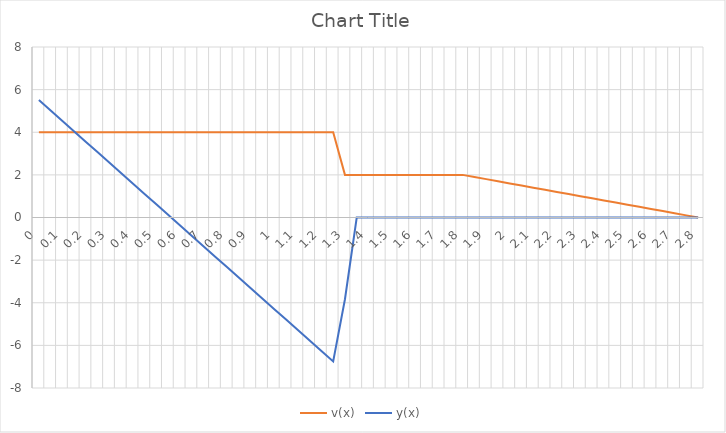
| Category | v(x) | y(x) |
|---|---|---|
| 0.0 | 4 | 5.51 |
| 0.05 | 4 | 5.019 |
| 0.1 | 4 | 4.528 |
| 0.15 | 4 | 4.038 |
| 0.2 | 4 | 3.548 |
| 0.25 | 4 | 3.057 |
| 0.3 | 4 | 2.566 |
| 0.35 | 4 | 2.076 |
| 0.4 | 4 | 1.586 |
| 0.45 | 4 | 1.095 |
| 0.5 | 4 | 0.605 |
| 0.55 | 4 | 0.114 |
| 0.6 | 4 | -0.377 |
| 0.65 | 4 | -0.867 |
| 0.7 | 4 | -1.357 |
| 0.75 | 4 | -1.848 |
| 0.8 | 4 | -2.338 |
| 0.85 | 4 | -2.829 |
| 0.9 | 4 | -3.319 |
| 0.95 | 4 | -3.81 |
| 1.0 | 4 | -4.301 |
| 1.05 | 4 | -4.791 |
| 1.1 | 4 | -5.281 |
| 1.15 | 4 | -5.772 |
| 1.2 | 4 | -6.263 |
| 1.25 | 4 | -6.753 |
| 1.3 | 2 | -3.835 |
| 1.35 | 2 | 0 |
| 1.4 | 2 | 0 |
| 1.45 | 2 | 0 |
| 1.5 | 2 | 0 |
| 1.55 | 2 | 0 |
| 1.6 | 2 | 0 |
| 1.65 | 2 | 0 |
| 1.7 | 2 | 0 |
| 1.75 | 2 | 0 |
| 1.8 | 2 | 0 |
| 1.85 | 1.9 | 0 |
| 1.9 | 1.8 | 0 |
| 1.95 | 1.7 | 0 |
| 2.0 | 1.6 | 0 |
| 2.05 | 1.5 | 0 |
| 2.1 | 1.4 | 0 |
| 2.15 | 1.3 | 0 |
| 2.2 | 1.2 | 0 |
| 2.25 | 1.1 | 0 |
| 2.3 | 1 | 0 |
| 2.35 | 0.9 | 0 |
| 2.4 | 0.8 | 0 |
| 2.45 | 0.7 | 0 |
| 2.5 | 0.6 | 0 |
| 2.55 | 0.5 | 0 |
| 2.6 | 0.4 | 0 |
| 2.65 | 0.3 | 0 |
| 2.7 | 0.2 | 0 |
| 2.75 | 0.1 | 0 |
| 2.8 | 0 | 0 |